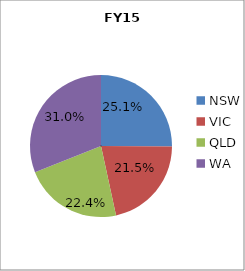
| Category | FY15 |
|---|---|
| NSW | 0.251 |
| VIC | 0.215 |
| QLD | 0.224 |
| WA | 0.31 |